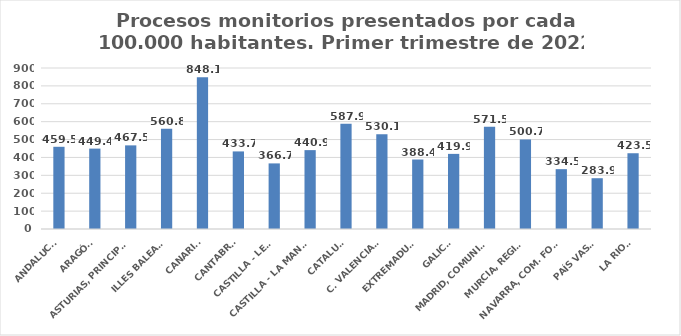
| Category | Series 0 |
|---|---|
| ANDALUCÍA | 459.508 |
| ARAGÓN | 449.393 |
| ASTURIAS, PRINCIPADO | 467.497 |
| ILLES BALEARS | 560.848 |
| CANARIAS | 848.093 |
| CANTABRIA | 433.682 |
| CASTILLA - LEÓN | 366.699 |
| CASTILLA - LA MANCHA | 440.943 |
| CATALUÑA | 587.938 |
| C. VALENCIANA | 530.07 |
| EXTREMADURA | 388.43 |
| GALICIA | 419.909 |
| MADRID, COMUNIDAD | 571.506 |
| MURCIA, REGIÓN | 500.706 |
| NAVARRA, COM. FORAL | 334.533 |
| PAÍS VASCO | 283.889 |
| LA RIOJA | 423.494 |